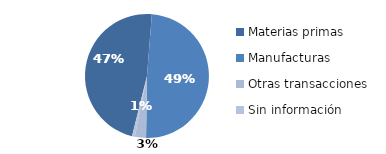
| Category | Series 0 |
|---|---|
| Materias primas | 423.833 |
| Manufacturas | 438.458 |
| Otras transacciones | 26.166 |
| Sin información | 6.497 |